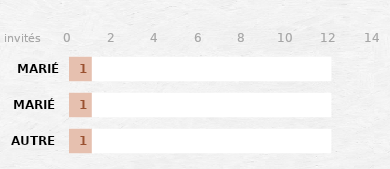
| Category | Series 1 | Series 0 |
|---|---|---|
| AUTRE | 12 | 1 |
| MARIÉ | 12 | 1 |
| MARIÉE | 12 | 1 |